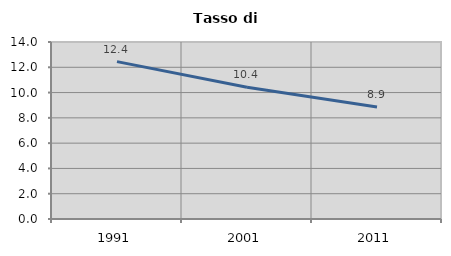
| Category | Tasso di disoccupazione   |
|---|---|
| 1991.0 | 12.449 |
| 2001.0 | 10.416 |
| 2011.0 | 8.859 |